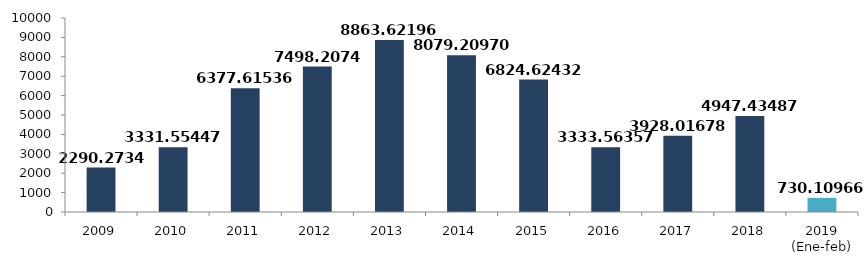
| Category | Series 0 |
|---|---|
| 2009 | 2290.273 |
| 2010 | 3331.554 |
| 2011 | 6377.615 |
| 2012 | 7498.207 |
| 2013 | 8863.622 |
| 2014 | 8079.21 |
| 2015 | 6824.624 |
| 2016 | 3333.564 |
| 2017 | 3928.017 |
| 2018 | 4947.435 |
| 2019 (Ene-feb) | 730.11 |